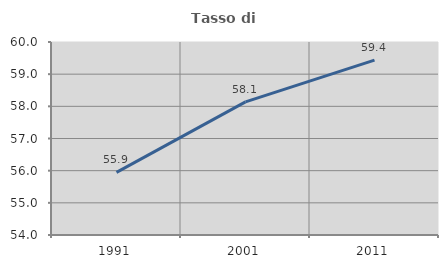
| Category | Tasso di occupazione   |
|---|---|
| 1991.0 | 55.949 |
| 2001.0 | 58.14 |
| 2011.0 | 59.438 |